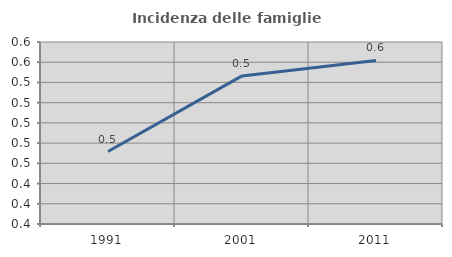
| Category | Incidenza delle famiglie numerose |
|---|---|
| 1991.0 | 0.472 |
| 2001.0 | 0.546 |
| 2011.0 | 0.562 |